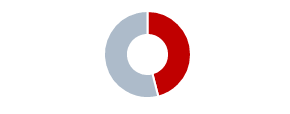
| Category | Series 0 |
|---|---|
| 0 | 0.46 |
| 1 | 0.54 |